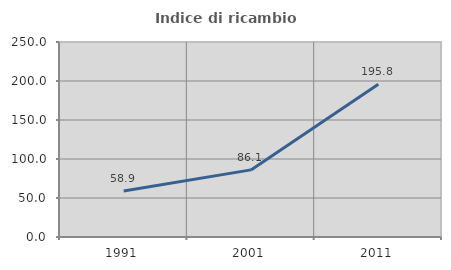
| Category | Indice di ricambio occupazionale  |
|---|---|
| 1991.0 | 58.924 |
| 2001.0 | 86.05 |
| 2011.0 | 195.767 |